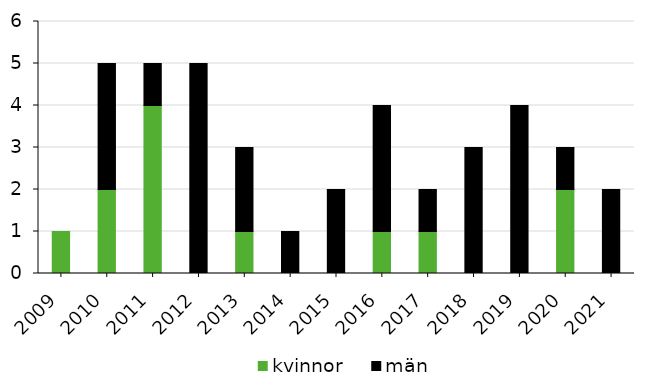
| Category | kvinnor | män |
|---|---|---|
| 2009 | 1 | 0 |
| 2010 | 2 | 3 |
| 2011 | 4 | 1 |
| 2012 | 0 | 5 |
| 2013 | 1 | 2 |
| 2014 | 0 | 1 |
| 2015 | 0 | 2 |
| 2016 | 1 | 3 |
| 2017 | 1 | 1 |
| 2018 | 0 | 3 |
| 2019 | 0 | 4 |
| 2020 | 2 | 1 |
| 2021 | 0 | 2 |